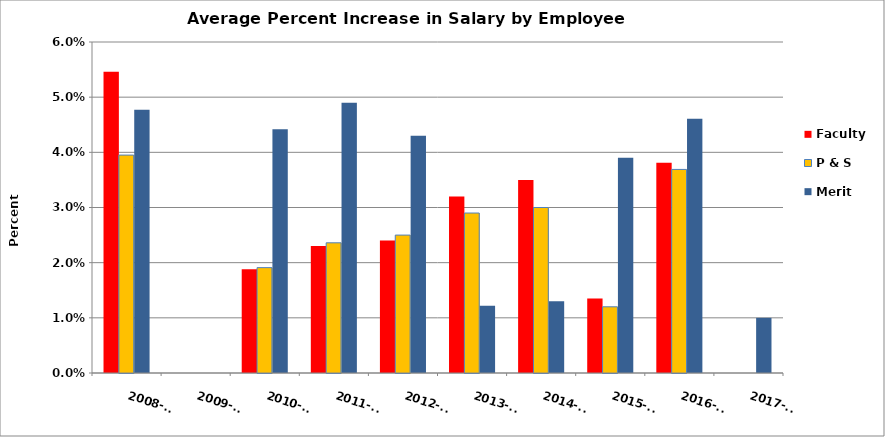
| Category | Faculty | P & S | Merit |
|---|---|---|---|
| 2008-09 | 0.055 | 0.04 | 0.048 |
| 2009-10 | 0 | 0 | 0 |
| 2010-11 | 0.019 | 0.019 | 0.044 |
| 2011-12 | 0.023 | 0.024 | 0.049 |
| 2012-13 | 0.024 | 0.025 | 0.043 |
| 2013-14 | 0.032 | 0.029 | 0.012 |
| 2014-15 | 0.035 | 0.03 | 0.013 |
| 2015-16 | 0.014 | 0.012 | 0.039 |
| 2016-17 | 0.038 | 0.037 | 0.046 |
| 2017-18 | 0 | 0 | 0.01 |